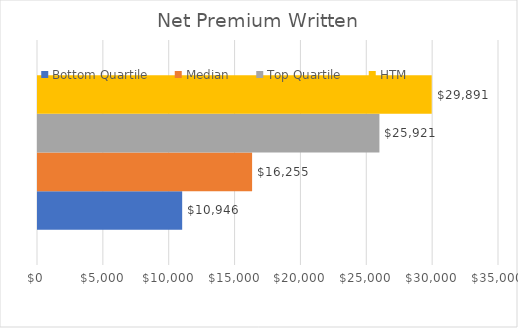
| Category | Bottom Quartile | Median | Top Quartile | HTM  |
|---|---|---|---|---|
| 0 | 10946 | 16255 | 25921 | 29891 |